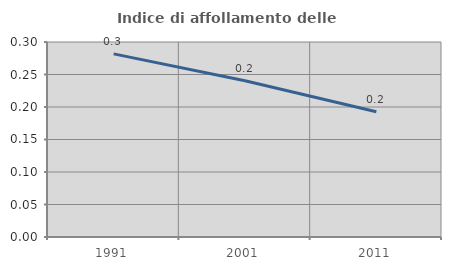
| Category | Indice di affollamento delle abitazioni  |
|---|---|
| 1991.0 | 0.282 |
| 2001.0 | 0.24 |
| 2011.0 | 0.193 |